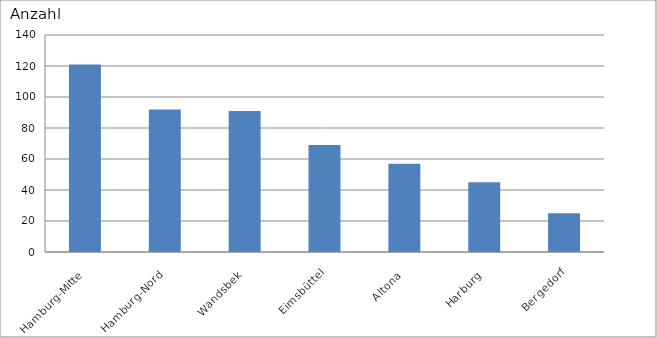
| Category | Hamburg-Mitte |
|---|---|
| Hamburg-Mitte | 121 |
| Hamburg-Nord | 92 |
| Wandsbek | 91 |
| Eimsbüttel | 69 |
| Altona | 57 |
| Harburg | 45 |
| Bergedorf | 25 |